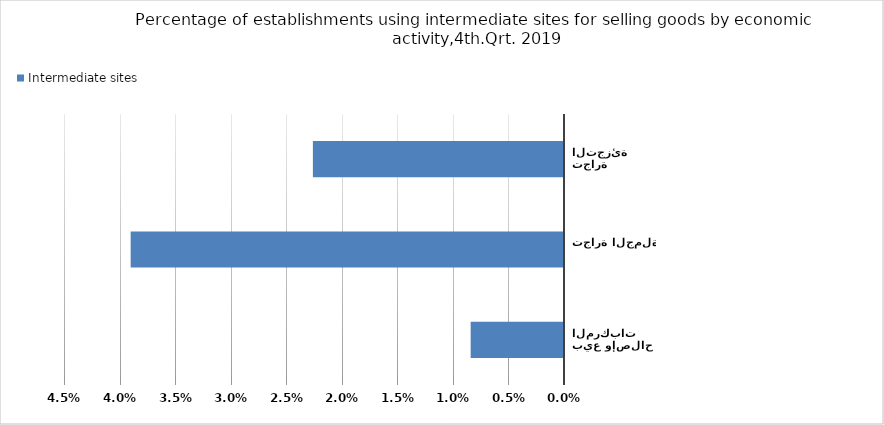
| Category | Intermediate sites |
|---|---|
| بيع وإصلاح المركبات  | 0.008 |
| تجارة الجملة | 0.039 |
| تجارة التجزئة | 0.023 |